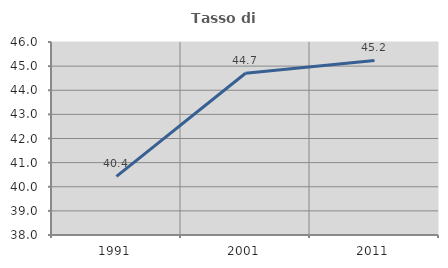
| Category | Tasso di occupazione   |
|---|---|
| 1991.0 | 40.427 |
| 2001.0 | 44.705 |
| 2011.0 | 45.235 |